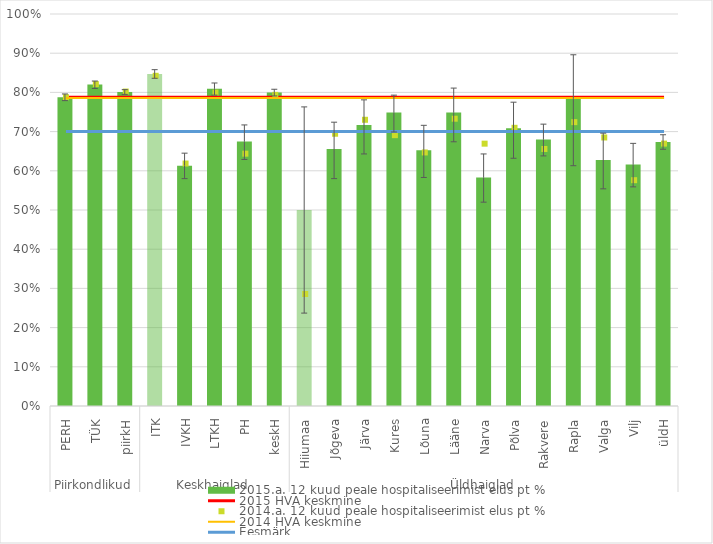
| Category | 2015.a. 12 kuud peale hospitaliseerimist elus pt % |
|---|---|
| 0 | 0.788 |
| 1 | 0.82 |
| 2 | 0.801 |
| 3 | 0.847 |
| 4 | 0.613 |
| 5 | 0.809 |
| 6 | 0.675 |
| 7 | 0.8 |
| 8 | 0.5 |
| 9 | 0.655 |
| 10 | 0.717 |
| 11 | 0.749 |
| 12 | 0.652 |
| 13 | 0.749 |
| 14 | 0.583 |
| 15 | 0.708 |
| 16 | 0.68 |
| 17 | 0.784 |
| 18 | 0.628 |
| 19 | 0.616 |
| 20 | 0.674 |